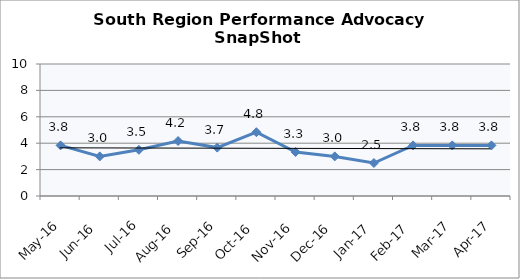
| Category | South Region |
|---|---|
| May-16 | 3.833 |
| Jun-16 | 3 |
| Jul-16 | 3.5 |
| Aug-16 | 4.167 |
| Sep-16 | 3.667 |
| Oct-16 | 4.833 |
| Nov-16 | 3.333 |
| Dec-16 | 3 |
| Jan-17 | 2.5 |
| Feb-17 | 3.833 |
| Mar-17 | 3.833 |
| Apr-17 | 3.833 |